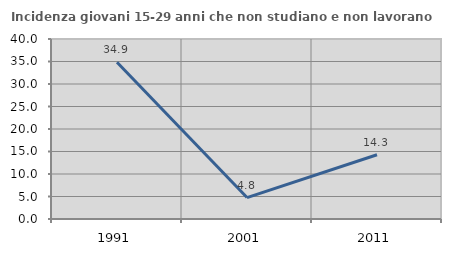
| Category | Incidenza giovani 15-29 anni che non studiano e non lavorano  |
|---|---|
| 1991.0 | 34.852 |
| 2001.0 | 4.762 |
| 2011.0 | 14.286 |